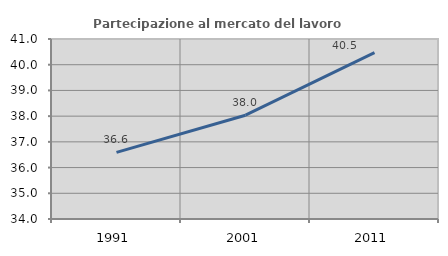
| Category | Partecipazione al mercato del lavoro  femminile |
|---|---|
| 1991.0 | 36.591 |
| 2001.0 | 38.036 |
| 2011.0 | 40.471 |